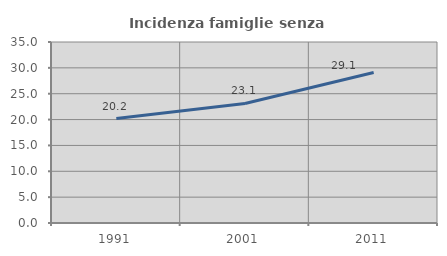
| Category | Incidenza famiglie senza nuclei |
|---|---|
| 1991.0 | 20.188 |
| 2001.0 | 23.118 |
| 2011.0 | 29.1 |